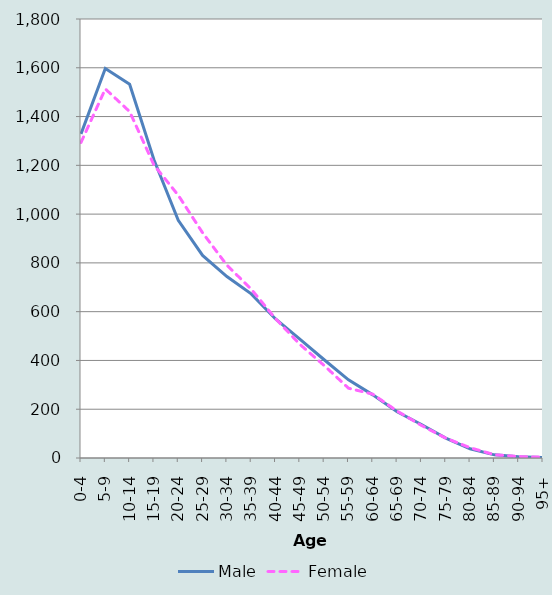
| Category | Male | Female |
|---|---|---|
| 0-4 | 1328865.2 | 1293907.24 |
| 5-9 | 1596953.6 | 1513337.8 |
| 10-14 | 1532675.9 | 1420330.7 |
| 15-19 | 1222766.32 | 1201331.58 |
| 20-24 | 974703.2 | 1077286.8 |
| 25-29 | 830518.72 | 923481.79 |
| 30-34 | 744101.44 | 790723.87 |
| 35-39 | 672943.07 | 692219.3 |
| 40-44 | 570156.82 | 571381.35 |
| 45-49 | 487378.01 | 465934.483 |
| 50-54 | 402819.662 | 379296.92 |
| 55-59 | 320358.03 | 286219.3 |
| 60-64 | 258925.86 | 261586.561 |
| 65-69 | 189802.641 | 192472.042 |
| 70-74 | 137206.94 | 133586.031 |
| 75-79 | 81316.3 | 81474.882 |
| 80-84 | 37627.511 | 42243.95 |
| 85-89 | 12915.46 | 13479.3 |
| 90-94 | 4942.41 | 5911.51 |
| 95+ | 1964.63 | 3242.08 |